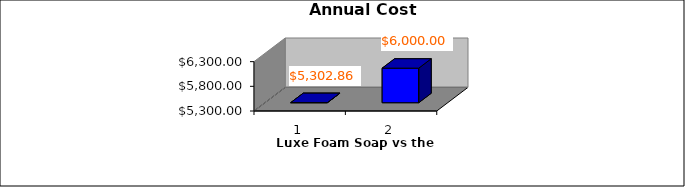
| Category | Series 0 |
|---|---|
| 0 | 5302.857 |
| 1 | 6000 |